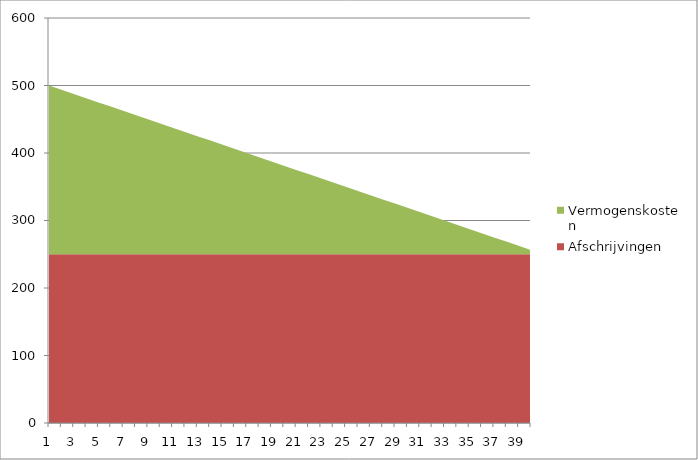
| Category | Afschrijvingen | Vermogenskosten |
|---|---|---|
| 0 | 250 | 250 |
| 1 | 250 | 243.75 |
| 2 | 250 | 237.5 |
| 3 | 250 | 231.25 |
| 4 | 250 | 225 |
| 5 | 250 | 218.75 |
| 6 | 250 | 212.5 |
| 7 | 250 | 206.25 |
| 8 | 250 | 200 |
| 9 | 250 | 193.75 |
| 10 | 250 | 187.5 |
| 11 | 250 | 181.25 |
| 12 | 250 | 175 |
| 13 | 250 | 168.75 |
| 14 | 250 | 162.5 |
| 15 | 250 | 156.25 |
| 16 | 250 | 150 |
| 17 | 250 | 143.75 |
| 18 | 250 | 137.5 |
| 19 | 250 | 131.25 |
| 20 | 250 | 125 |
| 21 | 250 | 118.75 |
| 22 | 250 | 112.5 |
| 23 | 250 | 106.25 |
| 24 | 250 | 100 |
| 25 | 250 | 93.75 |
| 26 | 250 | 87.5 |
| 27 | 250 | 81.25 |
| 28 | 250 | 75 |
| 29 | 250 | 68.75 |
| 30 | 250 | 62.5 |
| 31 | 250 | 56.25 |
| 32 | 250 | 50 |
| 33 | 250 | 43.75 |
| 34 | 250 | 37.5 |
| 35 | 250 | 31.25 |
| 36 | 250 | 25 |
| 37 | 250 | 18.75 |
| 38 | 250 | 12.5 |
| 39 | 250 | 6.25 |